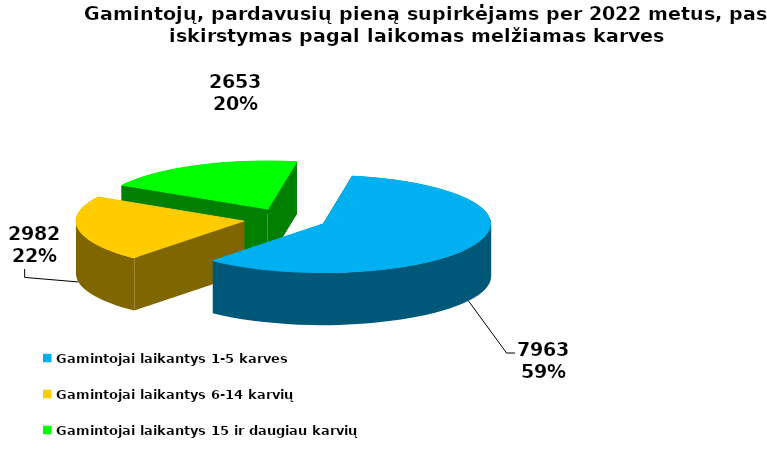
| Category | Gamintojų sk. |
|---|---|
| Gamintojai laikantys 1-5 karves | 7963 |
| Gamintojai laikantys 6-14 karvių | 2982 |
| Gamintojai laikantys 15 ir daugiau karvių | 2653 |